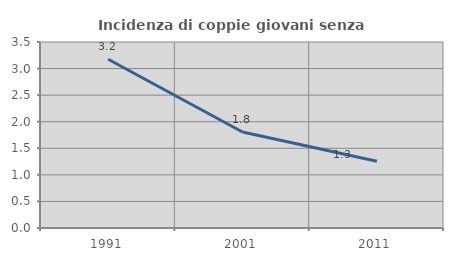
| Category | Incidenza di coppie giovani senza figli |
|---|---|
| 1991.0 | 3.175 |
| 2001.0 | 1.806 |
| 2011.0 | 1.254 |